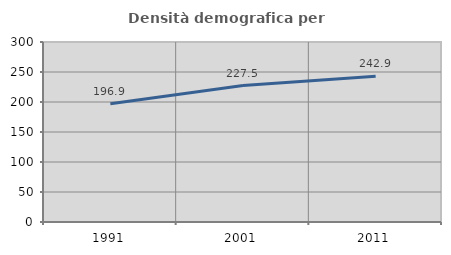
| Category | Densità demografica |
|---|---|
| 1991.0 | 196.938 |
| 2001.0 | 227.488 |
| 2011.0 | 242.932 |